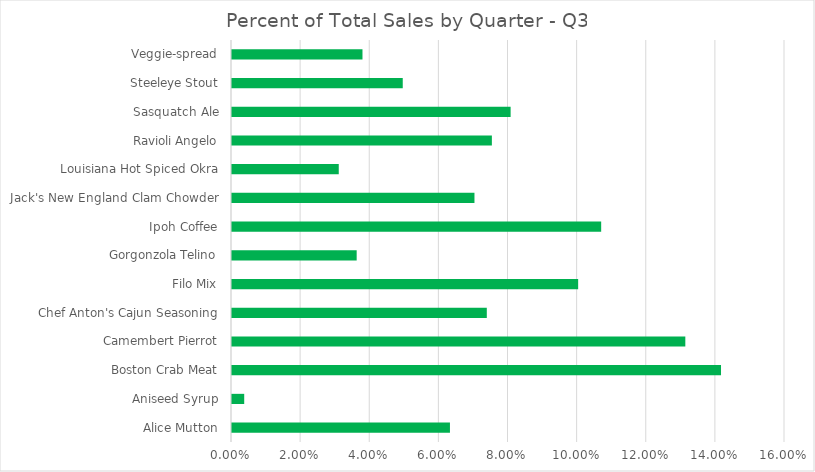
| Category | Percent of Q3 |
|---|---|
| Alice Mutton | 0.063 |
| Aniseed Syrup | 0.004 |
| Boston Crab Meat | 0.141 |
| Camembert Pierrot | 0.131 |
| Chef Anton's Cajun Seasoning | 0.074 |
| Filo Mix | 0.1 |
| Gorgonzola Telino | 0.036 |
| Ipoh Coffee | 0.107 |
| Jack's New England Clam Chowder | 0.07 |
| Louisiana Hot Spiced Okra | 0.031 |
| Ravioli Angelo | 0.075 |
| Sasquatch Ale | 0.081 |
| Steeleye Stout | 0.049 |
| Veggie-spread | 0.038 |